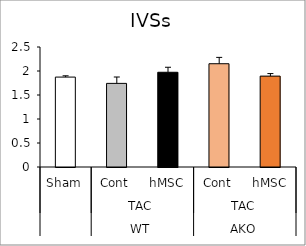
| Category | Series 0 |
|---|---|
| 0 | 1.873 |
| 1 | 1.742 |
| 2 | 1.973 |
| 3 | 2.152 |
| 4 | 1.893 |